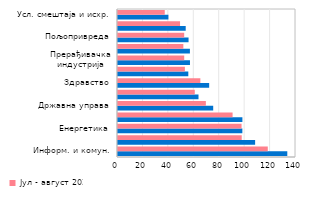
| Category | Јул - август 2021. | Јул - август 2020. |
|---|---|---|
| Информ. и комун. | 133.152 | 117.807 |
| Финансијски сектор | 107.854 | 97.308 |
| Енергетика | 97.805 | 97.178 |
| Рударство | 97.844 | 90.132 |
| Државна управа | 74.874 | 69.105 |
| Образовање | 63.319 | 60.394 |
| Здравство | 71.704 | 64.777 |
| Саобраћај и складиштење | 55.3 | 52.602 |
| Прерађивачка индустрија | 56.606 | 52.089 |
| Грађевинарство | 56.56 | 51.4 |
| Пољопривреда | 55.495 | 52.064 |
| Трговина | 53.251 | 48.812 |
| Усл. смештаја и исхр. | 39.656 | 36.774 |